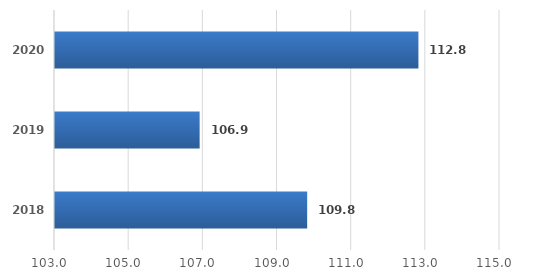
| Category | Series 0 |
|---|---|
| 2018.0 | 109.8 |
| 2019.0 | 106.9 |
| 2020.0 | 112.8 |